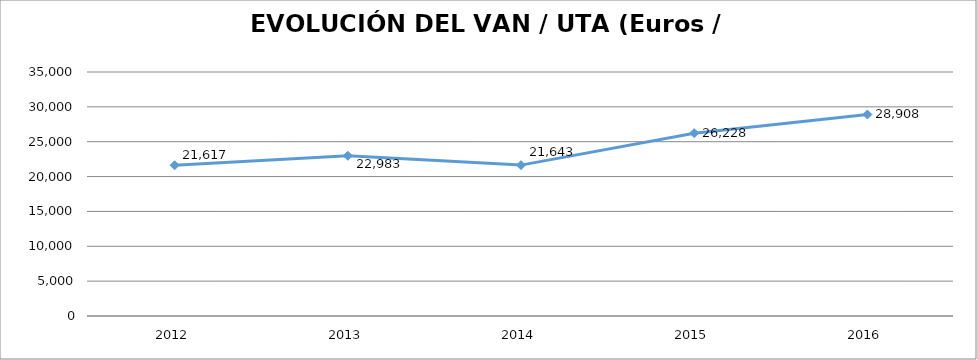
| Category | 2012 |
|---|---|
| 2012.0 | 21617.21 |
| 2013.0 | 22982.591 |
| 2014.0 | 21643.401 |
| 2015.0 | 26228.389 |
| 2016.0 | 28908.028 |